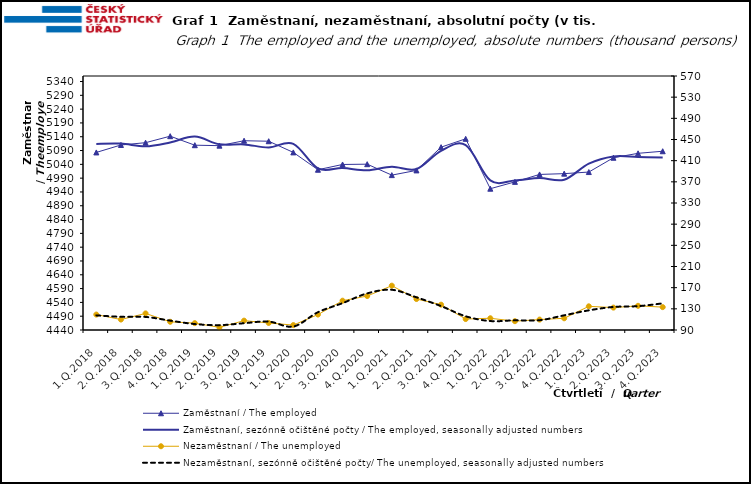
| Category | Zaměstnaní / The employed | Zaměstnaní, sezónně očištěné počty / The employed, seasonally adjusted numbers |
|---|---|---|
| 1.Q.2018 | 5083.179 | 5114.138 |
| 2.Q.2018 | 5110.163 | 5115.089 |
| 3.Q.2018 | 5118.428 | 5105.243 |
| 4.Q.2018 | 5142.05 | 5119.364 |
| 1.Q.2019 | 5109.352 | 5140.464 |
| 2.Q.2019 | 5107.692 | 5112.613 |
| 3.Q.2019 | 5125.549 | 5112.325 |
| 4.Q.2019 | 5123.768 | 5101.176 |
| 1.Q.2020 | 5083.305 | 5114.288 |
| 2.Q.2020 | 5020.458 | 5025.282 |
| 3.Q.2020 | 5039.545 | 5026.521 |
| 4.Q.2020 | 5040.581 | 5018.355 |
| 1.Q.2021 | 5001.014 | 5031.519 |
| 2.Q.2021 | 5018.083 | 5022.901 |
| 3.Q.2021 | 5102.241 | 5089.044 |
| 4.Q.2021 | 5132.436 | 5109.8 |
| 1.Q.2022 | 4951.782 | 4982.012 |
| 2.Q.2022 | 4976.521 | 4981.278 |
| 3.Q.2022 | 5003.507 | 4990.549 |
| 4.Q.2022 | 5006.314 | 4984.258 |
| 1.Q.2023 | 5012.111 | 5042.73 |
| 2.Q.2023 | 5063.915 | 5068.729 |
| 3.Q.2023 | 5079.916 | 5066.75 |
| 4.Q.2023 | 5087.471 | 5065.067 |